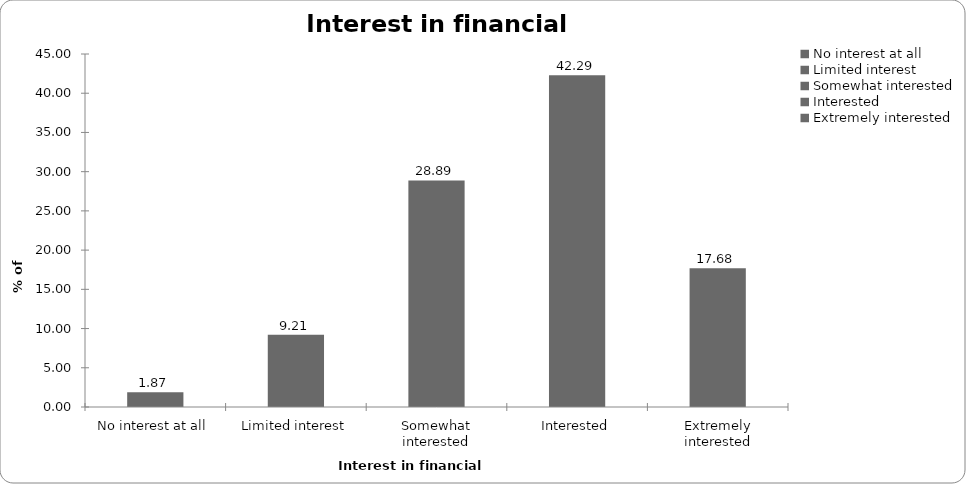
| Category | Interest in financial planning |
|---|---|
| No interest at all | 1.868 |
| Limited interest | 9.206 |
| Somewhat interested | 28.886 |
| Interested | 42.295 |
| Extremely interested | 17.678 |